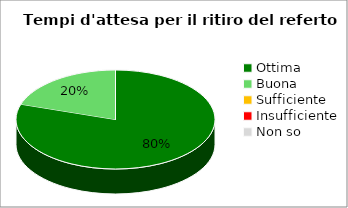
| Category | Series 0 |
|---|---|
| Ottima | 28 |
| Buona | 7 |
| Sufficiente | 0 |
| Insufficiente | 0 |
| Non so | 0 |